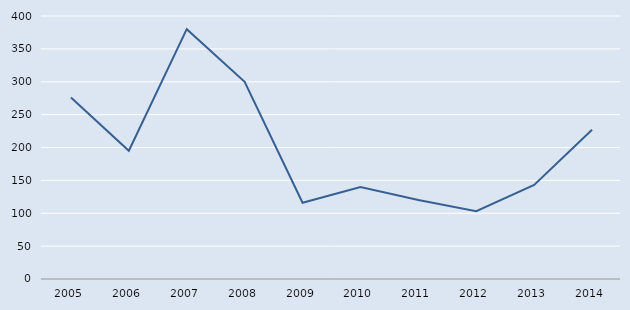
| Category | Series 0 |
|---|---|
| 2005.0 | 276 |
| 2006.0 | 195 |
| 2007.0 | 380 |
| 2008.0 | 300 |
| 2009.0 | 116 |
| 2010.0 | 140 |
| 2011.0 | 120 |
| 2012.0 | 103 |
| 2013.0 | 143 |
| 2014.0 | 227 |